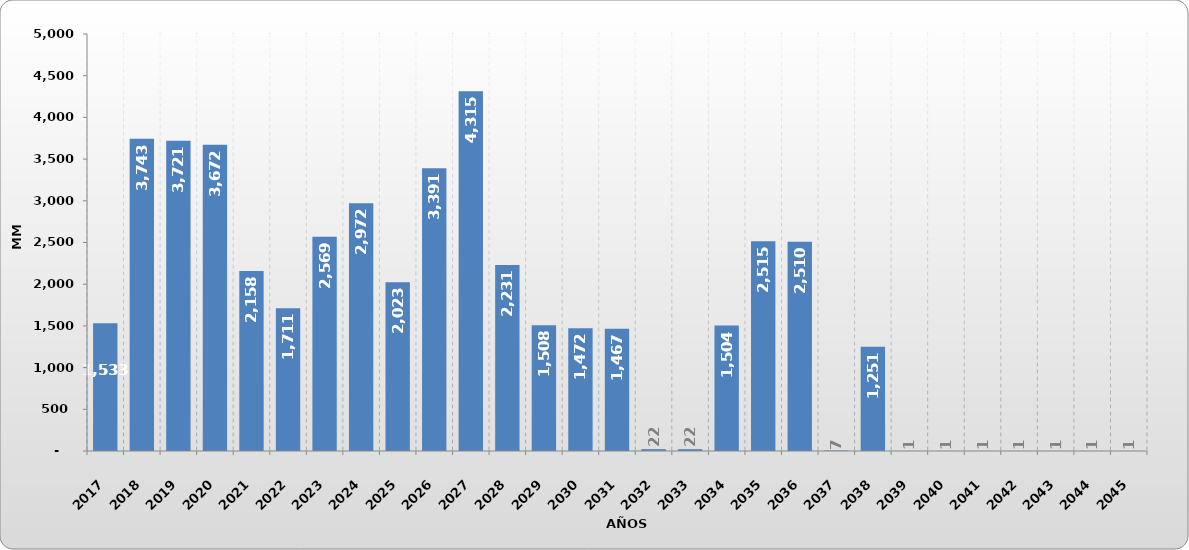
| Category | Total 
(MM USD.) |
|---|---|
| 2017.0 | 1532.783 |
| 2018.0 | 3742.606 |
| 2019.0 | 3721.47 |
| 2020.0 | 3672.181 |
| 2021.0 | 2157.966 |
| 2022.0 | 1710.879 |
| 2023.0 | 2569.163 |
| 2024.0 | 2971.872 |
| 2025.0 | 2022.745 |
| 2026.0 | 3390.591 |
| 2027.0 | 4314.894 |
| 2028.0 | 2231.135 |
| 2029.0 | 1508.17 |
| 2030.0 | 1471.686 |
| 2031.0 | 1466.698 |
| 2032.0 | 22.313 |
| 2033.0 | 22.043 |
| 2034.0 | 1504.201 |
| 2035.0 | 2515.201 |
| 2036.0 | 2510.132 |
| 2037.0 | 6.681 |
| 2038.0 | 1250.711 |
| 2039.0 | 0.708 |
| 2040.0 | 0.708 |
| 2041.0 | 0.708 |
| 2042.0 | 0.708 |
| 2043.0 | 0.708 |
| 2044.0 | 0.708 |
| 2045.0 | 0.708 |